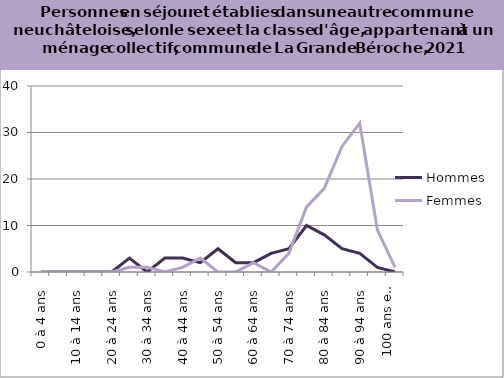
| Category | Hommes | Femmes |
|---|---|---|
| 0 à 4 ans | 0 | 0 |
| 5 à 9 ans | 0 | 0 |
| 10 à 14 ans | 0 | 0 |
| 15 à 19 ans | 0 | 0 |
| 20 à 24 ans | 0 | 0 |
| 25 à 29 ans | 3 | 1 |
| 30 à 34 ans | 0 | 1 |
| 35 à 39 ans | 3 | 0 |
| 40 à 44 ans | 3 | 1 |
| 45 à 49 ans | 2 | 3 |
| 50 à 54 ans | 5 | 0 |
| 55 à 59 ans | 2 | 0 |
| 60 à 64 ans | 2 | 2 |
| 65 à 69 ans | 4 | 0 |
| 70 à 74 ans | 5 | 4 |
| 75 à 79 ans | 10 | 14 |
| 80 à 84 ans | 8 | 18 |
| 85 à 89 ans | 5 | 27 |
| 90 à 94 ans | 4 | 32 |
| 95 à 99 ans | 1 | 9 |
| 100 ans et plus | 0 | 1 |